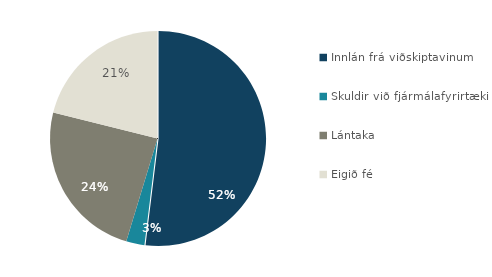
| Category | Series 0 |
|---|---|
| Innlán frá viðskiptavinum | 605158 |
| Skuldir við fjármálafyrirtæki | 32062 |
| Lántaka | 281874 |
| Eigið fé | 246057 |